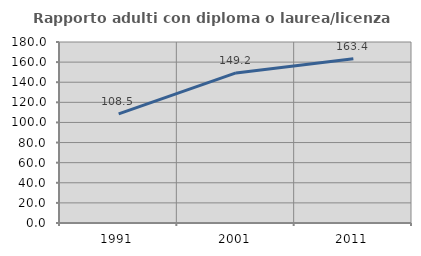
| Category | Rapporto adulti con diploma o laurea/licenza media  |
|---|---|
| 1991.0 | 108.468 |
| 2001.0 | 149.245 |
| 2011.0 | 163.386 |